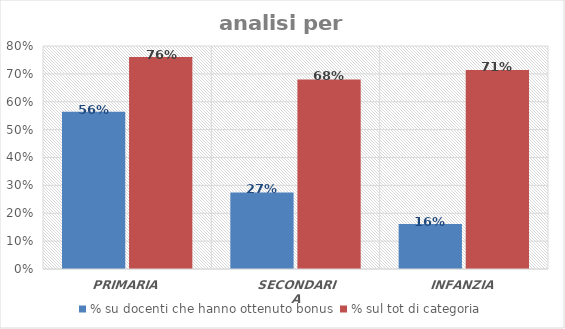
| Category | % su docenti che hanno ottenuto bonus | % sul tot di categoria |
|---|---|---|
| PRIMARIA | 0.565 | 0.761 |
| SECONDARIA | 0.274 | 0.68 |
| INFANZIA | 0.161 | 0.714 |